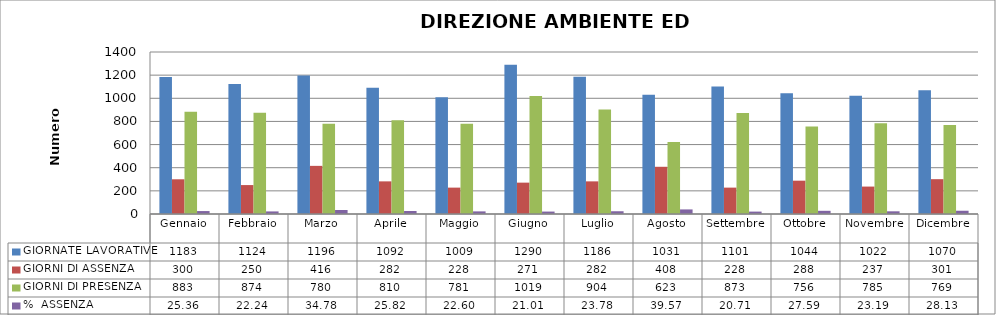
| Category | GIORNATE LAVORATIVE | GIORNI DI ASSENZA | GIORNI DI PRESENZA | %  ASSENZA |
|---|---|---|---|---|
| Gennaio | 1183 | 300 | 883 | 25.359 |
| Febbraio | 1124 | 250 | 874 | 22.242 |
| Marzo | 1196 | 416 | 780 | 34.783 |
| Aprile | 1092 | 282 | 810 | 25.824 |
| Maggio | 1009 | 228 | 781 | 22.597 |
| Giugno | 1290 | 271 | 1019 | 21.008 |
| Luglio | 1186 | 282 | 904 | 23.777 |
| Agosto | 1031 | 408 | 623 | 39.573 |
| Settembre | 1101 | 228 | 873 | 20.708 |
| Ottobre | 1044 | 288 | 756 | 27.586 |
| Novembre | 1022 | 237 | 785 | 23.19 |
| Dicembre | 1070 | 301 | 769 | 28.131 |